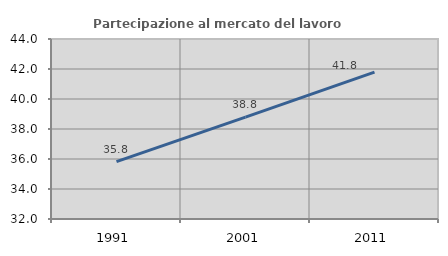
| Category | Partecipazione al mercato del lavoro  femminile |
|---|---|
| 1991.0 | 35.828 |
| 2001.0 | 38.796 |
| 2011.0 | 41.79 |